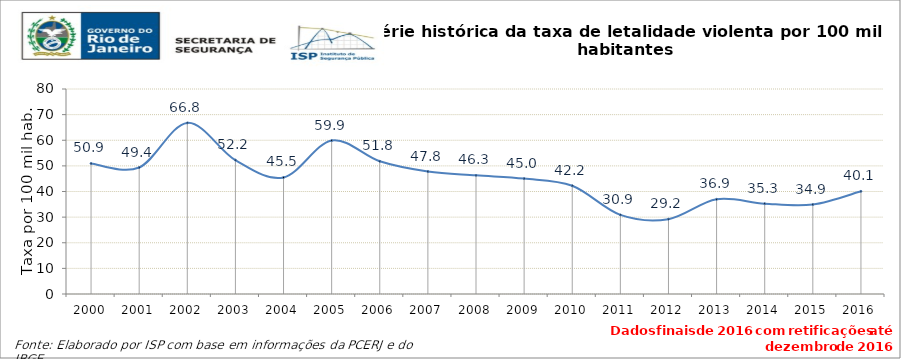
| Category | Series 0 |
|---|---|
| 2000.0 | 50.935 |
| 2001.0 | 49.365 |
| 2002.0 | 66.77 |
| 2003.0 | 52.249 |
| 2004.0 | 45.474 |
| 2005.0 | 59.892 |
| 2006.0 | 51.793 |
| 2007.0 | 47.805 |
| 2008.0 | 46.316 |
| 2009.0 | 45.04 |
| 2010.0 | 42.236 |
| 2011.0 | 30.875 |
| 2012.0 | 29.214 |
| 2013.0 | 36.944 |
| 2014.0 | 35.259 |
| 2015.0 | 34.913 |
| 2016.0 | 40.075 |